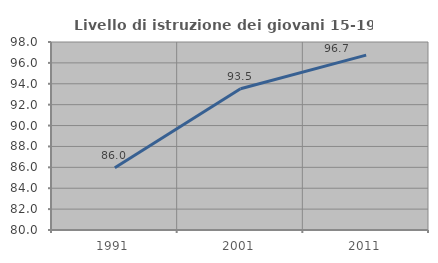
| Category | Livello di istruzione dei giovani 15-19 anni |
|---|---|
| 1991.0 | 85.965 |
| 2001.0 | 93.519 |
| 2011.0 | 96.739 |